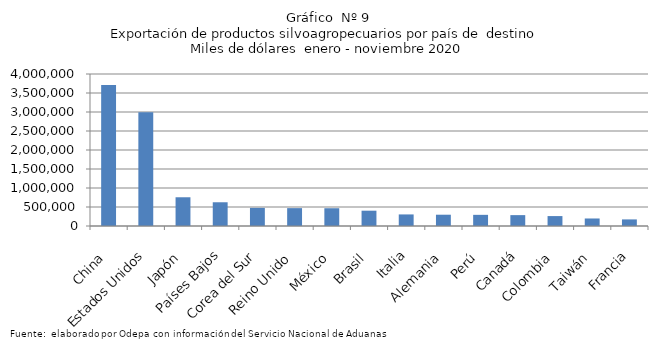
| Category | Series 0 |
|---|---|
| China | 3707597.315 |
| Estados Unidos | 2992427.215 |
| Japón | 756192.564 |
| Países Bajos | 624656.417 |
| Corea del Sur | 476719.844 |
| Reino Unido | 470268.688 |
| México | 467589.448 |
| Brasil | 402881.174 |
| Italia | 304550.237 |
| Alemania | 297063.141 |
| Perú | 293645.105 |
| Canadá | 286193.208 |
| Colombia | 261162.164 |
| Taiwán | 197884.812 |
| Francia | 173376.893 |